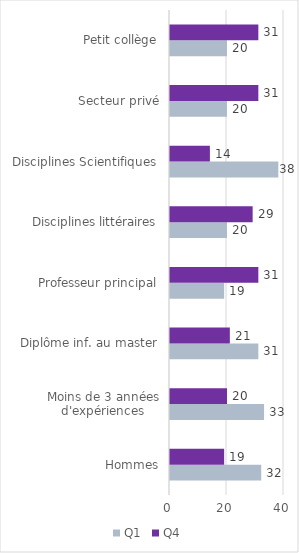
| Category | Q1 | Q4 |
|---|---|---|
| Hommes | 32 | 19 |
| Moins de 3 années d'expériences | 33 | 20 |
| Diplôme inf. au master | 31 | 21 |
| Professeur principal | 19 | 31 |
| Disciplines littéraires | 20 | 29 |
| Disciplines Scientifiques | 38 | 14 |
| Secteur privé | 20 | 31 |
| Petit collège | 20 | 31 |